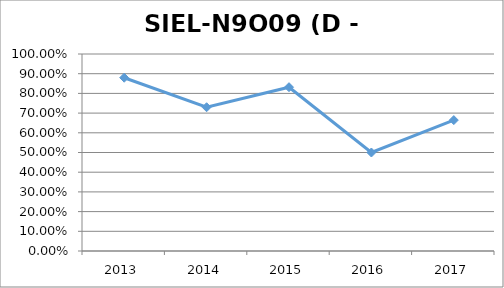
| Category | SIEL-N9O09 |
|---|---|
| 2013.0 | 0.88 |
| 2014.0 | 0.73 |
| 2015.0 | 0.831 |
| 2016.0 | 0.5 |
| 2017.0 | 0.664 |